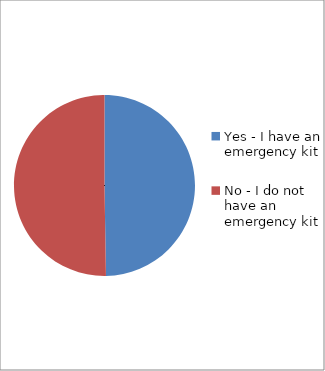
| Category | Series 0 |
|---|---|
| Yes - I have an emergency kit | 0.497 |
| No - I do not have an emergency kit | 0.503 |